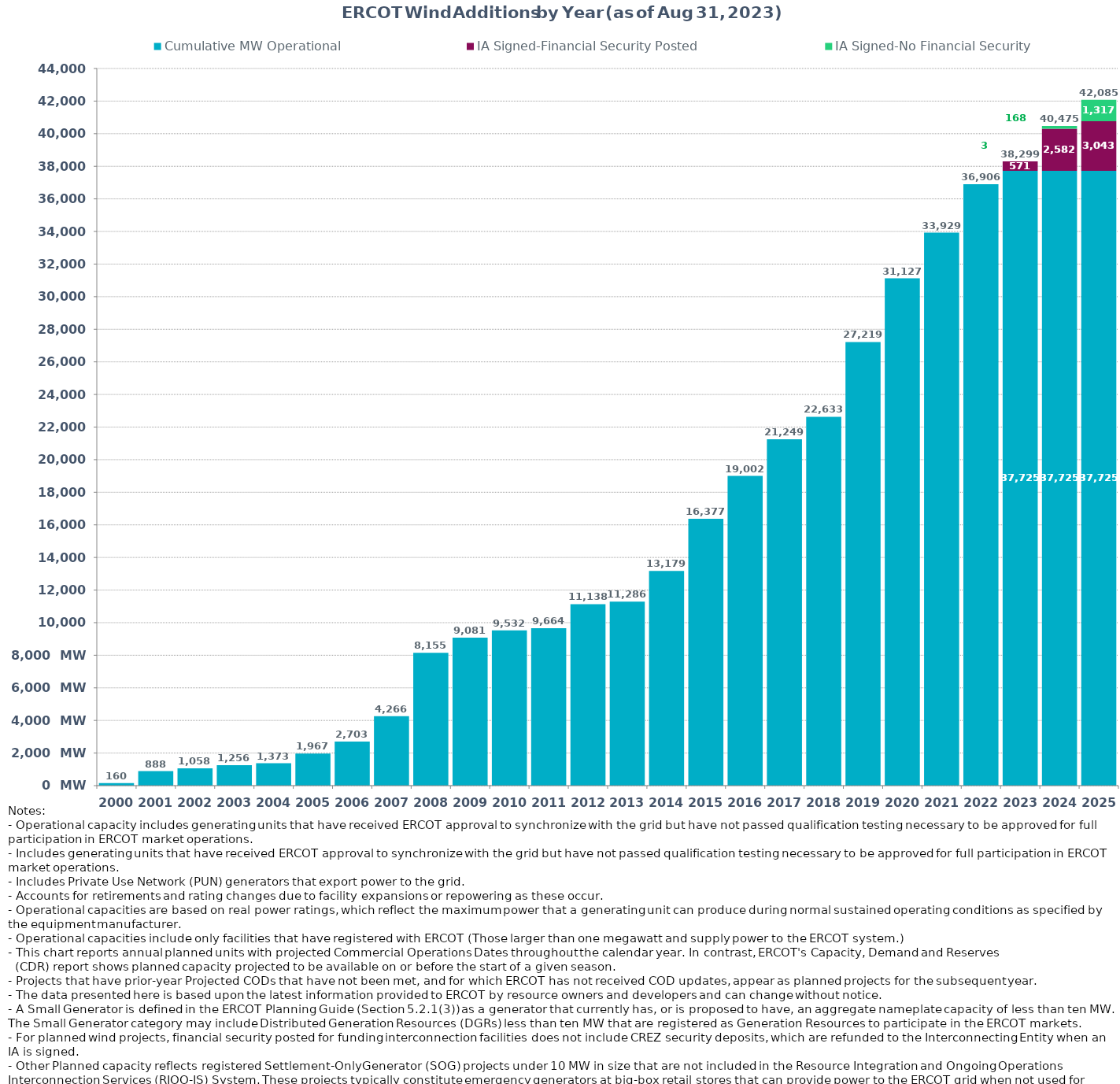
| Category | Cumulative MW Operational | IA Signed-Financial Security Posted  | IA Signed-No Financial Security  | Other Planned | Cumulative Installed and Planned |
|---|---|---|---|---|---|
| 2000.0 | 160.37 | 0 | 0 | 0 | 160.37 |
| 2001.0 | 887.97 | 0 | 0 | 0 | 887.97 |
| 2002.0 | 1058.22 | 0 | 0 | 0 | 1058.22 |
| 2003.0 | 1255.72 | 0 | 0 | 0 | 1255.72 |
| 2004.0 | 1372.82 | 0 | 0 | 0 | 1372.82 |
| 2005.0 | 1967.04 | 0 | 0 | 0 | 1967.04 |
| 2006.0 | 2703.34 | 0 | 0 | 0 | 2703.34 |
| 2007.0 | 4266.36 | 0 | 0 | 0 | 4266.36 |
| 2008.0 | 8154.76 | 0 | 0 | 0 | 8154.76 |
| 2009.0 | 9080.78 | 0 | 0 | 0 | 9080.78 |
| 2010.0 | 9531.7 | 0 | 0 | 0 | 9531.7 |
| 2011.0 | 9663.7 | 0 | 0 | 0 | 9663.7 |
| 2012.0 | 11137.66 | 0 | 0 | 0 | 11137.66 |
| 2013.0 | 11286.26 | 0 | 0 | 0 | 11286.26 |
| 2014.0 | 13178.84 | 0 | 0 | 0 | 13178.84 |
| 2015.0 | 16376.53 | 0 | 0 | 0 | 16376.53 |
| 2016.0 | 19001.85 | 0 | 0 | 0 | 19001.85 |
| 2017.0 | 21248.99 | 0 | 0 | 0 | 21248.99 |
| 2018.0 | 22632.69 | 0 | 0 | 0 | 22632.69 |
| 2019.0 | 27219.34 | 0 | 0 | 0 | 27219.34 |
| 2020.0 | 31127.31 | 0 | 0 | 0 | 31127.31 |
| 2021.0 | 33928.91 | 0 | 0 | 0 | 33928.91 |
| 2022.0 | 36906.07 | 0 | 0 | 0 | 36906.07 |
| 2023.0 | 37724.73 | 570.92 | 3 | 0 | 38298.65 |
| 2024.0 | 37724.73 | 2581.54 | 168.42 | 0 | 40474.69 |
| 2025.0 | 37724.73 | 3043.3 | 1316.91 | 0 | 42084.94 |